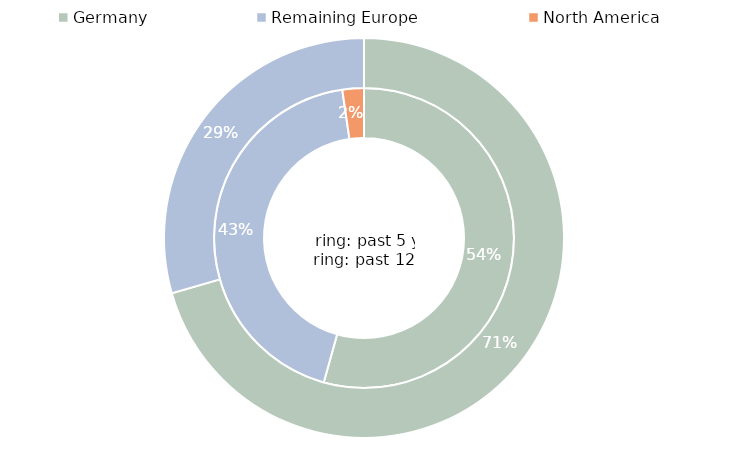
| Category | past 5 years | past 12 months |
|---|---|---|
| Germany | 1560136815.298 | 0.705 |
| Remaining Europe | 1244972992.552 | 0.295 |
| North America | 66527086.064 | 0 |